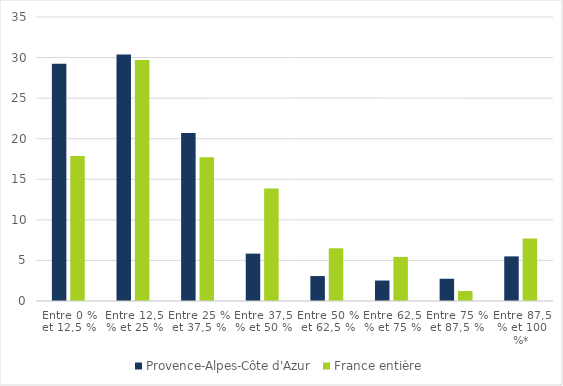
| Category | Provence-Alpes-Côte d'Azur | France entière |
|---|---|---|
| Entre 0 % et 12,5 % | 29.232 | 17.867 |
| Entre 12,5 % et 25 % | 30.377 | 29.688 |
| Entre 25 % et 37,5 % | 20.715 | 17.731 |
| Entre 37,5 % et 50 % | 5.839 | 13.853 |
| Entre 50 % et 62,5 % | 3.073 | 6.499 |
| Entre 62,5 % et 75 % | 2.524 | 5.438 |
| Entre 75 % et 87,5 % | 2.742 | 1.226 |
| Entre 87,5 % et 100 %* | 5.498 | 7.697 |